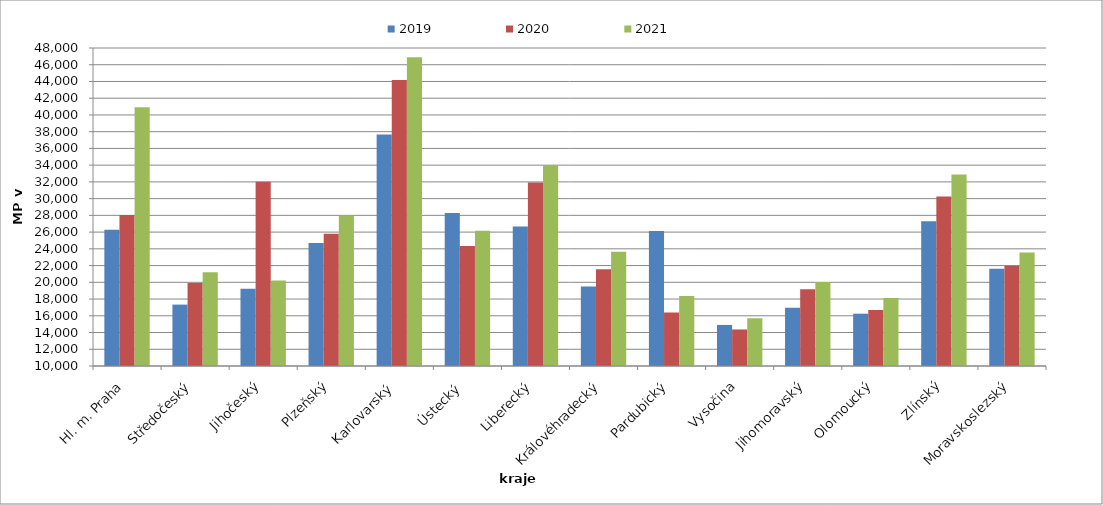
| Category | 2019 | 2020 | 2021 |
|---|---|---|---|
| Hl. m. Praha | 26273.143 | 28036.17 | 40918.588 |
| Středočeský | 17336.094 | 19922.914 | 21188.892 |
| Jihočeský | 19223.811 | 32007.133 | 20229.854 |
| Plzeňský | 24704.93 | 25798.134 | 27998.845 |
| Karlovarský  | 37673.563 | 44180 | 46899.512 |
| Ústecký   | 28273.457 | 24325.499 | 26148.476 |
| Liberecký | 26661.54 | 31940.472 | 34025.374 |
| Královéhradecký | 19509.093 | 21561.976 | 23642.463 |
| Pardubický | 26127.025 | 16393.683 | 18364.215 |
| Vysočina | 14907.804 | 14367.923 | 15706.216 |
| Jihomoravský | 16961.506 | 19163.786 | 20031.835 |
| Olomoucký | 16251.562 | 16688.729 | 18111.186 |
| Zlínský | 27299.479 | 30246.178 | 32885.258 |
| Moravskoslezský | 21632.216 | 21971.968 | 23570.125 |